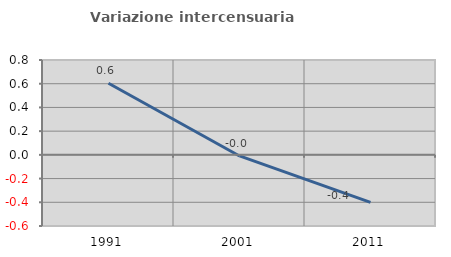
| Category | Variazione intercensuaria annua |
|---|---|
| 1991.0 | 0.603 |
| 2001.0 | -0.009 |
| 2011.0 | -0.4 |